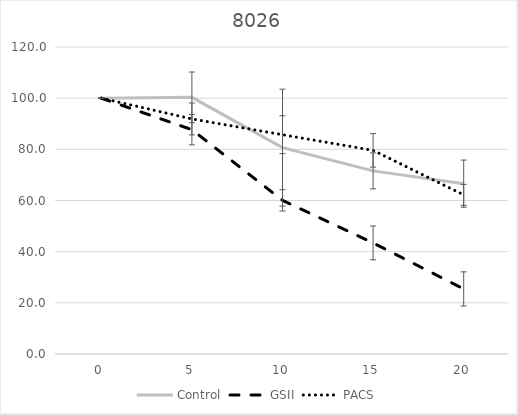
| Category | Control | GSII | PACS |
|---|---|---|---|
| 0.0 | 100 | 100 | 100 |
| 5.0 | 100.321 | 87.684 | 91.882 |
| 10.0 | 80.67 | 60.055 | 85.711 |
| 15.0 | 71.57 | 43.411 | 79.597 |
| 20.0 | 66.587 | 25.436 | 62.196 |